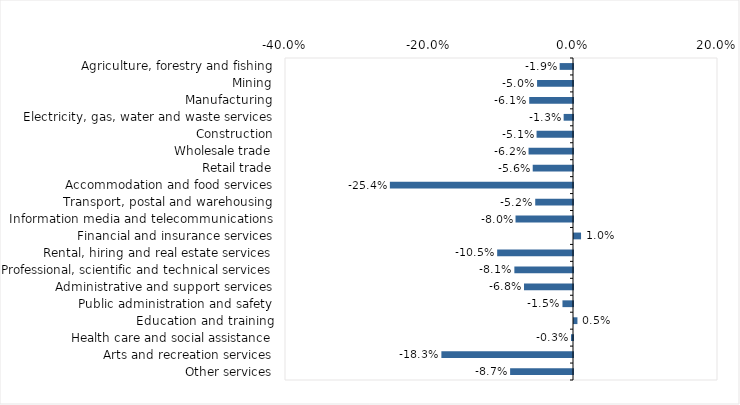
| Category | This week |
|---|---|
| Agriculture, forestry and fishing | -0.019 |
| Mining | -0.05 |
| Manufacturing | -0.061 |
| Electricity, gas, water and waste services | -0.013 |
| Construction | -0.051 |
| Wholesale trade | -0.062 |
| Retail trade | -0.056 |
| Accommodation and food services | -0.254 |
| Transport, postal and warehousing | -0.052 |
| Information media and telecommunications | -0.08 |
| Financial and insurance services | 0.01 |
| Rental, hiring and real estate services | -0.105 |
| Professional, scientific and technical services | -0.081 |
| Administrative and support services | -0.068 |
| Public administration and safety | -0.015 |
| Education and training | 0.005 |
| Health care and social assistance | -0.003 |
| Arts and recreation services | -0.183 |
| Other services | -0.087 |